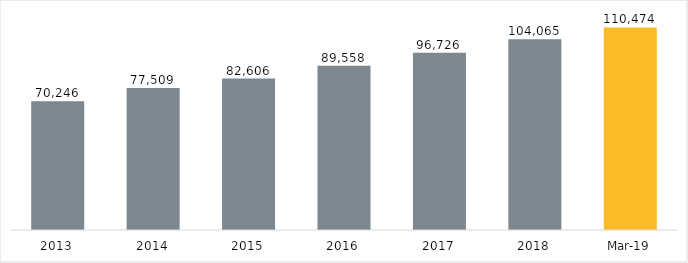
| Category | Series 0 |
|---|---|
| 2013.0 | 70246 |
| 2014.0 | 77509 |
| 2015.0 | 82606 |
| 2016.0 | 89558 |
| 2017.0 | 96726 |
| 2018.0 | 104065 |
| 43525.0 | 110474 |